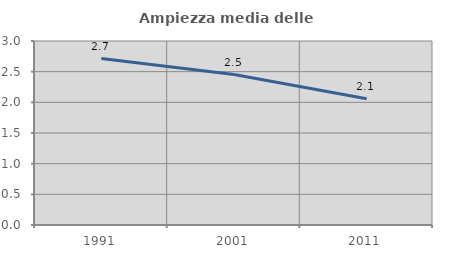
| Category | Ampiezza media delle famiglie |
|---|---|
| 1991.0 | 2.713 |
| 2001.0 | 2.453 |
| 2011.0 | 2.059 |